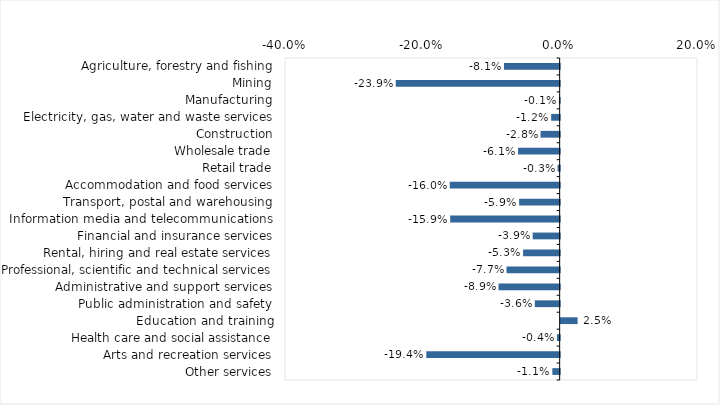
| Category | This week |
|---|---|
| Agriculture, forestry and fishing | -0.081 |
| Mining | -0.239 |
| Manufacturing | -0.001 |
| Electricity, gas, water and waste services | -0.012 |
| Construction | -0.028 |
| Wholesale trade | -0.061 |
| Retail trade | -0.003 |
| Accommodation and food services | -0.16 |
| Transport, postal and warehousing | -0.059 |
| Information media and telecommunications | -0.159 |
| Financial and insurance services | -0.039 |
| Rental, hiring and real estate services | -0.053 |
| Professional, scientific and technical services | -0.077 |
| Administrative and support services | -0.089 |
| Public administration and safety | -0.036 |
| Education and training | 0.025 |
| Health care and social assistance | -0.004 |
| Arts and recreation services | -0.194 |
| Other services | -0.011 |